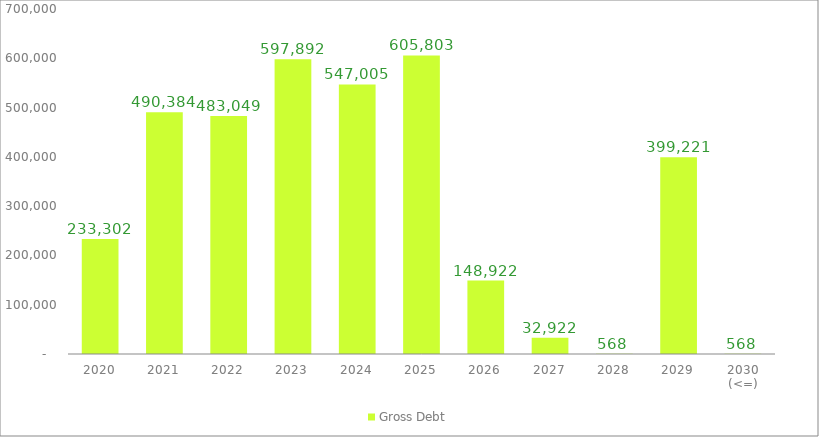
| Category | Gross Debt |
|---|---|
| 2020 | 233302.286 |
| 2021 | 490383.898 |
| 2022 | 483049.25 |
| 2023 | 597892.421 |
| 2024 | 547005.132 |
| 2025 | 605802.563 |
| 2026 | 148922.113 |
| 2027 | 32922.49 |
| 2028 | 567.533 |
| 2029 | 399220.723 |
| 2030 (<=) | 567.533 |